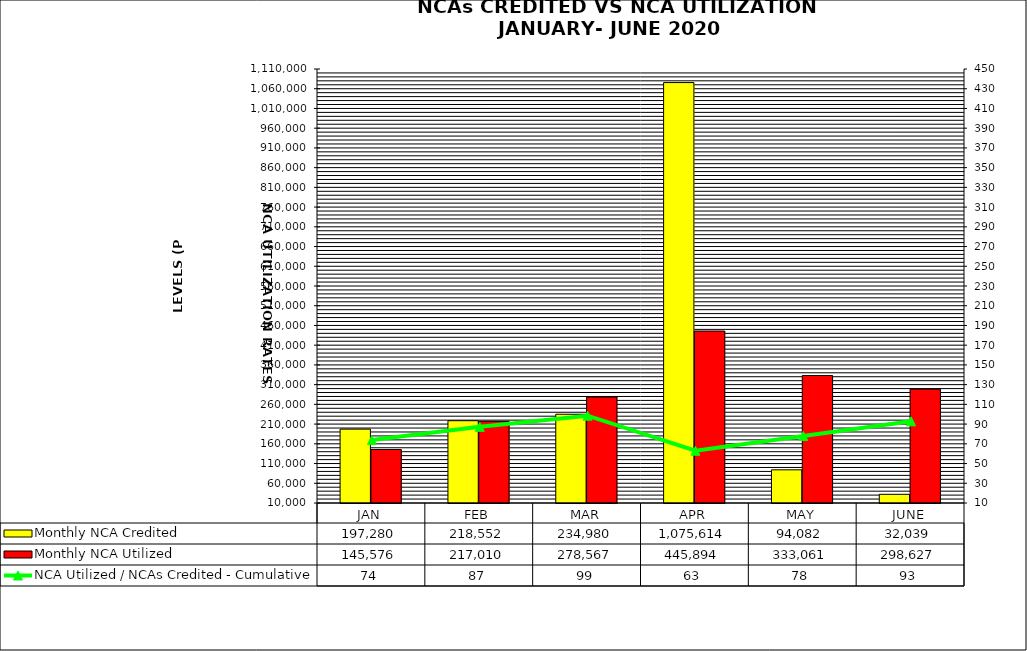
| Category | Monthly NCA Credited | Monthly NCA Utilized |
|---|---|---|
| JAN | 197280.374 | 145576.104 |
| FEB | 218551.98 | 217009.914 |
| MAR | 234979.638 | 278567.462 |
| APR | 1075614.496 | 445894.359 |
| MAY | 94082.13 | 333061.393 |
| JUNE | 32038.674 | 298626.929 |